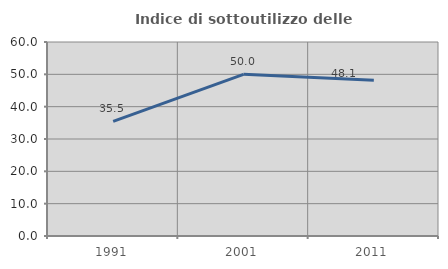
| Category | Indice di sottoutilizzo delle abitazioni  |
|---|---|
| 1991.0 | 35.477 |
| 2001.0 | 50 |
| 2011.0 | 48.148 |